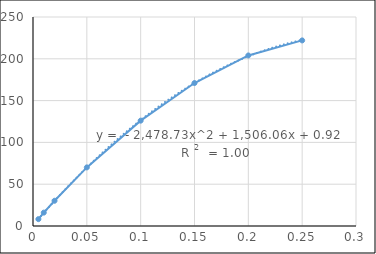
| Category | k |
|---|---|
| 0.005 | 8.2 |
| 0.01 | 16 |
| 0.02 | 30.2 |
| 0.05 | 70.1 |
| 0.1 | 126 |
| 0.15 | 171 |
| 0.2 | 204 |
| 0.25 | 222 |